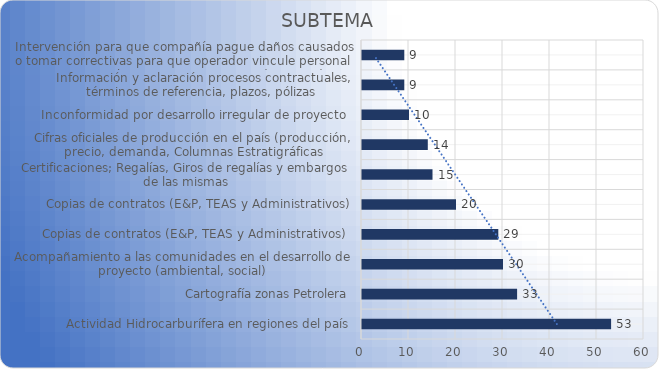
| Category | Series 0 |
|---|---|
| Actividad Hidrocarburífera en regiones del país | 53 |
| Cartografía zonas Petrolera | 33 |
| Acompañamiento a las comunidades en el desarrollo de proyecto (ambiental, social) | 30 |
| Copias de contratos (E&P, TEAS y Administrativos)  | 29 |
| Copias de contratos (E&P, TEAS y Administrativos) | 20 |
| Certificaciones; Regalías, Giros de regalías y embargos de las mismas | 15 |
| Cifras oficiales de producción en el país (producción, precio, demanda, Columnas Estratigráficas | 14 |
| Inconformidad por desarrollo irregular de proyecto  | 10 |
| Información y aclaración procesos contractuales, términos de referencia, plazos, pólizas  | 9 |
| Intervención para que compañía pague daños causados o tomar correctivas para que operador vincule personal por no pago a subcontratistas por parte de Operadoras  | 9 |